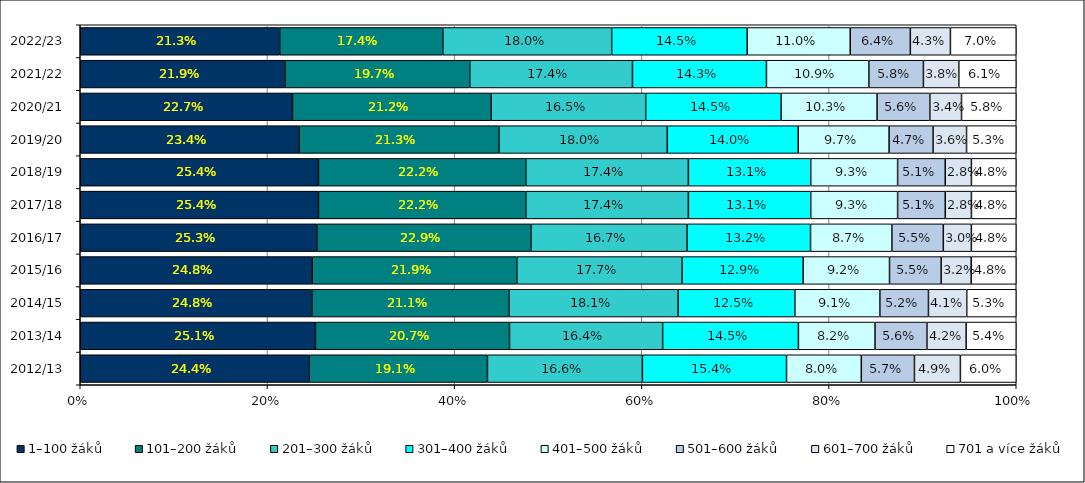
| Category | 1–100 žáků | 101–200 žáků | 201–300 žáků | 301–400 žáků | 401–500 žáků | 501–600 žáků | 601–700 žáků | 701 a více žáků |
|---|---|---|---|---|---|---|---|---|
| 2012/13 | 0.244 | 0.191 | 0.166 | 0.154 | 0.08 | 0.057 | 0.049 | 0.06 |
| 2013/14 | 0.251 | 0.207 | 0.164 | 0.145 | 0.082 | 0.056 | 0.042 | 0.054 |
| 2014/15 | 0.248 | 0.211 | 0.181 | 0.125 | 0.091 | 0.052 | 0.041 | 0.053 |
| 2015/16 | 0.248 | 0.219 | 0.177 | 0.129 | 0.092 | 0.055 | 0.032 | 0.048 |
| 2016/17 | 0.253 | 0.229 | 0.167 | 0.132 | 0.087 | 0.055 | 0.03 | 0.048 |
| 2017/18 | 0.254 | 0.222 | 0.174 | 0.131 | 0.093 | 0.051 | 0.028 | 0.048 |
| 2018/19 | 0.254 | 0.222 | 0.174 | 0.131 | 0.093 | 0.051 | 0.028 | 0.048 |
| 2019/20 | 0.234 | 0.213 | 0.18 | 0.14 | 0.097 | 0.047 | 0.036 | 0.053 |
| 2020/21 | 0.227 | 0.212 | 0.165 | 0.145 | 0.103 | 0.056 | 0.034 | 0.058 |
| 2021/22 | 0.219 | 0.197 | 0.174 | 0.143 | 0.109 | 0.058 | 0.038 | 0.061 |
| 2022/23 | 0.213 | 0.174 | 0.18 | 0.145 | 0.11 | 0.064 | 0.043 | 0.07 |